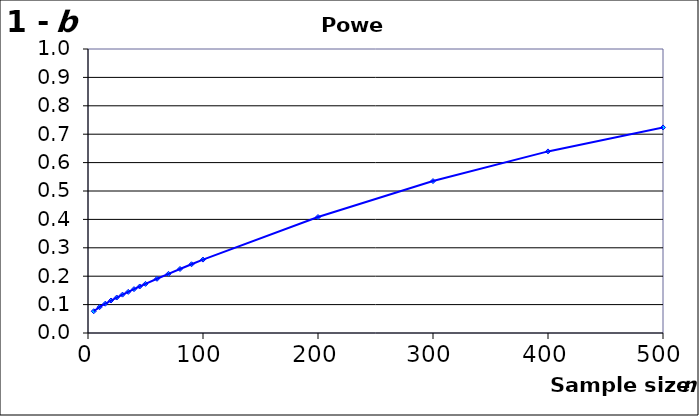
| Category | Power |
|---|---|
| 5.0 | 0.077 |
| 10.0 | 0.091 |
| 15.0 | 0.103 |
| 20.0 | 0.114 |
| 25.0 | 0.125 |
| 30.0 | 0.135 |
| 35.0 | 0.145 |
| 40.0 | 0.154 |
| 45.0 | 0.164 |
| 50.0 | 0.173 |
| 60.0 | 0.191 |
| 70.0 | 0.208 |
| 80.0 | 0.225 |
| 90.0 | 0.242 |
| 100.0 | 0.258 |
| 200.0 | 0.408 |
| 300.0 | 0.535 |
| 400.0 | 0.639 |
| 500.0 | 0.724 |